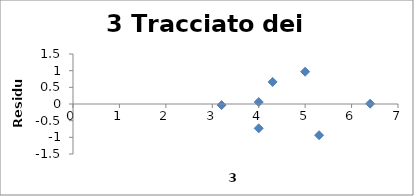
| Category | Series 0 |
|---|---|
| 3.2 | -0.033 |
| 4.0 | -0.73 |
| 4.3 | 0.661 |
| 5.0 | 0.969 |
| 5.3 | -0.936 |
| 6.4 | 0.01 |
| 4.0 | 0.059 |